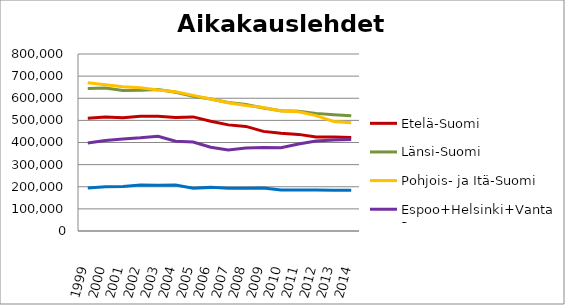
| Category | Etelä-Suomi | Länsi-Suomi | Pohjois- ja Itä-Suomi | Espoo+Helsinki+Vantaa | Muu Uusimaa |
|---|---|---|---|---|---|
| 1999.0 | 510081 | 644506 | 669775 | 398021 | 194813 |
| 2000.0 | 515313 | 646099 | 661106 | 408554 | 200366 |
| 2001.0 | 512218 | 635178 | 652006 | 415887 | 201626 |
| 2002.0 | 518798 | 635657 | 647012 | 420996 | 207722 |
| 2003.0 | 518249 | 639305 | 637673 | 427903 | 206764 |
| 2004.0 | 512653 | 627097 | 629605 | 405353 | 207343 |
| 2005.0 | 515645 | 608696 | 612991 | 401846 | 193426 |
| 2006.0 | 496176 | 596940 | 596689 | 378789 | 197167 |
| 2007.0 | 479666 | 581079 | 579630 | 366255 | 192966 |
| 2008.0 | 472735 | 571542 | 566789 | 374973 | 193326 |
| 2009.0 | 450278 | 555507 | 558532 | 377435 | 194124 |
| 2010.0 | 441315 | 543234 | 542841 | 376718 | 184988 |
| 2011.0 | 436667 | 541347 | 538726 | 393196 | 185400 |
| 2012.0 | 425020 | 531622 | 521315 | 407144 | 185197 |
| 2013.0 | 425321 | 525411 | 494717 | 411535 | 183655 |
| 2014.0 | 422855 | 520884 | 489191 | 413678 | 184457 |